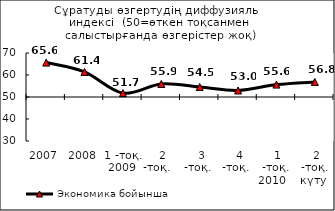
| Category | Экономика бойынша |
|---|---|
| 2007 | 65.649 |
| 2008 | 61.389 |
| 1 -тоқ. 2009 | 51.745 |
|  2 -тоқ.   | 55.93 |
|  3 -тоқ.  | 54.535 |
|  4 -тоқ.  | 52.965 |
|  1 -тоқ. 2010   | 55.64 |
|  2 -тоқ. күту  | 56.83 |